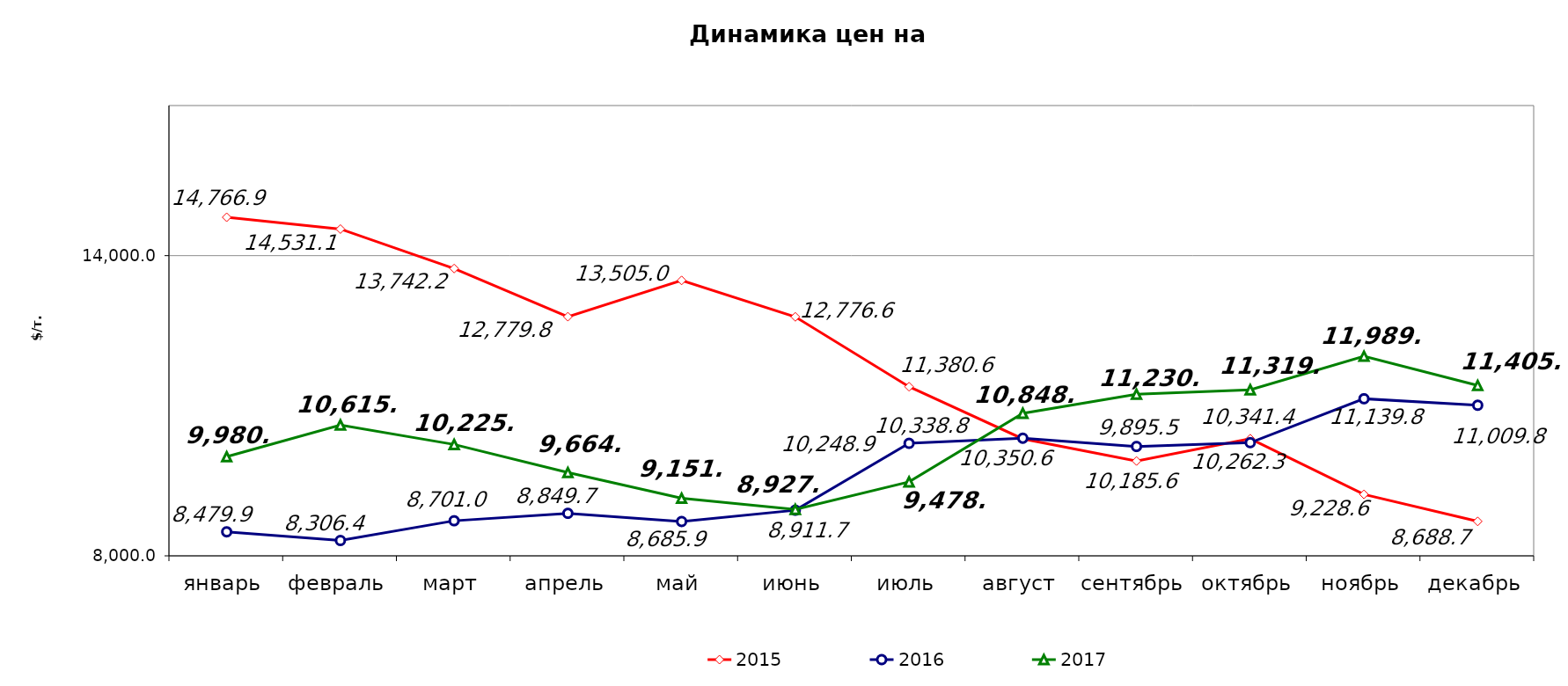
| Category | 2015 | 2016 | 2017 |
|---|---|---|---|
| январь | 14766.91 | 8479.88 | 9980.72 |
| февраль | 14531.125 | 8306.427 | 10615.53 |
| март | 13742.161 | 8700.954 | 10225.65 |
| апрель | 12779.75 | 8849.65 | 9664.86 |
| май | 13504.999 | 8685.88 | 9150.96 |
| июнь | 12776.591 | 8911.702 | 8927.62 |
| июль | 11380.55 | 10248.927 | 9478.69 |
| август | 10338.75 | 10350.567 | 10848.52 |
| сентябрь | 9895.46 | 10185.57 | 11230.36 |
| октябрь | 10341.37 | 10262.27 | 11319.66 |
| ноябрь | 9228.571 | 11139.772 | 11989.89 |
| декабрь | 8688.691 | 11009.75 | 11405.66 |